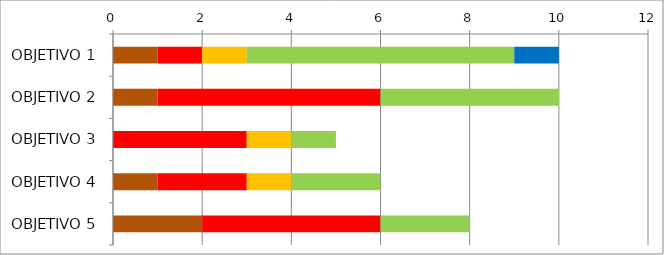
| Category | Series 0 | Series 1 | Series 2 | Series 3 | Series 4 | Series 5 |
|---|---|---|---|---|---|---|
| OBJETIVO 1 | 1 | 0 | 1 | 1 | 6 | 1 |
| OBJETIVO 2 | 1 | 0 | 5 | 0 | 4 | 0 |
| OBJETIVO 3 | 0 | 0 | 3 | 1 | 1 | 0 |
| OBJETIVO 4 | 1 | 0 | 2 | 1 | 2 | 0 |
| OBJETIVO 5 | 2 | 0 | 4 | 0 | 2 | 0 |